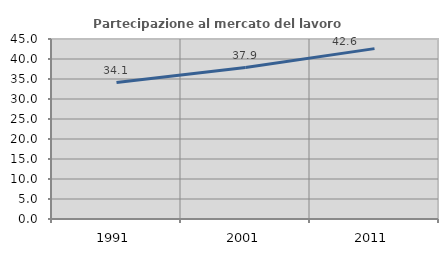
| Category | Partecipazione al mercato del lavoro  femminile |
|---|---|
| 1991.0 | 34.124 |
| 2001.0 | 37.852 |
| 2011.0 | 42.593 |